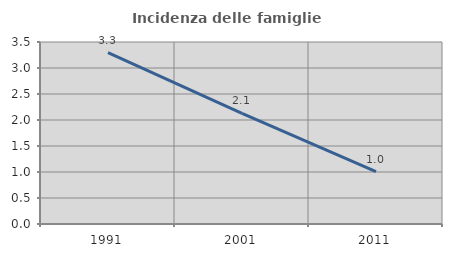
| Category | Incidenza delle famiglie numerose |
|---|---|
| 1991.0 | 3.294 |
| 2001.0 | 2.126 |
| 2011.0 | 1.007 |